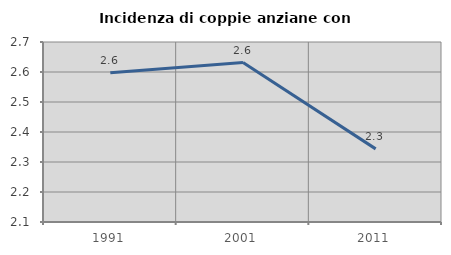
| Category | Incidenza di coppie anziane con figli |
|---|---|
| 1991.0 | 2.597 |
| 2001.0 | 2.632 |
| 2011.0 | 2.344 |